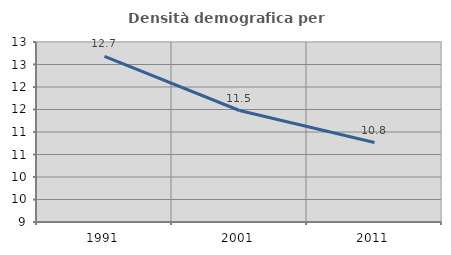
| Category | Densità demografica |
|---|---|
| 1991.0 | 12.679 |
| 2001.0 | 11.477 |
| 2011.0 | 10.766 |